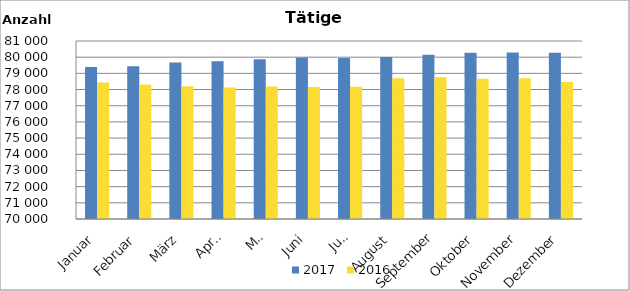
| Category | 2017 | 2016 |
|---|---|---|
| Januar | 79392 | 78433 |
| Februar | 79433 | 78318 |
| März | 79665 | 78205 |
| April | 79754 | 78127 |
| Mai | 79867 | 78191 |
| Juni | 79987 | 78165 |
| Juli | 79946 | 78175 |
| August | 80013 | 78692 |
| September | 80148 | 78764 |
| Oktober | 80271 | 78660 |
| November | 80296 | 78704 |
| Dezember | 80267 | 78464 |